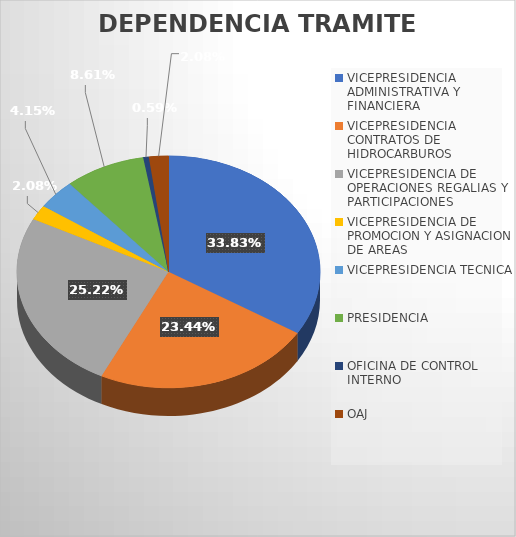
| Category | CANTIDAD |
|---|---|
| VICEPRESIDENCIA ADMINISTRATIVA Y FINANCIERA | 114 |
| VICEPRESIDENCIA CONTRATOS DE HIDROCARBUROS | 79 |
| VICEPRESIDENCIA DE OPERACIONES REGALIAS Y PARTICIPACIONES | 85 |
| VICEPRESIDENCIA DE PROMOCION Y ASIGNACION DE AREAS | 7 |
| VICEPRESIDENCIA TECNICA | 14 |
| PRESIDENCIA  | 29 |
| OFICINA DE CONTROL INTERNO | 2 |
| OAJ | 7 |